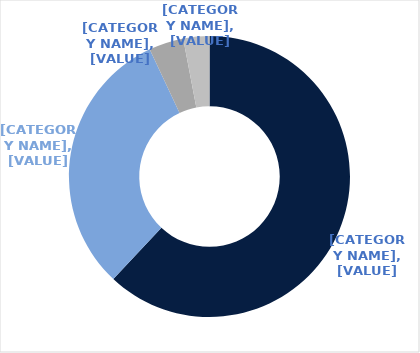
| Category | Series 0 |
|---|---|
| NSW | 0.62 |
| QLD | 0.31 |
| VIC | 0.04 |
| ACT | 0.03 |